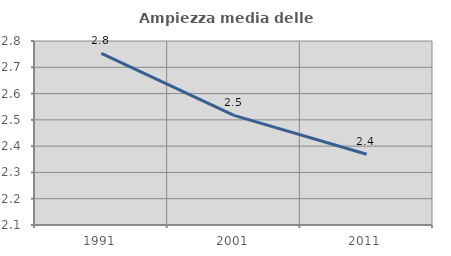
| Category | Ampiezza media delle famiglie |
|---|---|
| 1991.0 | 2.753 |
| 2001.0 | 2.517 |
| 2011.0 | 2.369 |